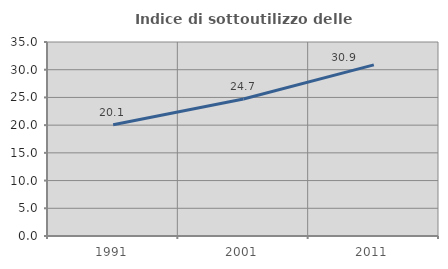
| Category | Indice di sottoutilizzo delle abitazioni  |
|---|---|
| 1991.0 | 20.054 |
| 2001.0 | 24.726 |
| 2011.0 | 30.869 |